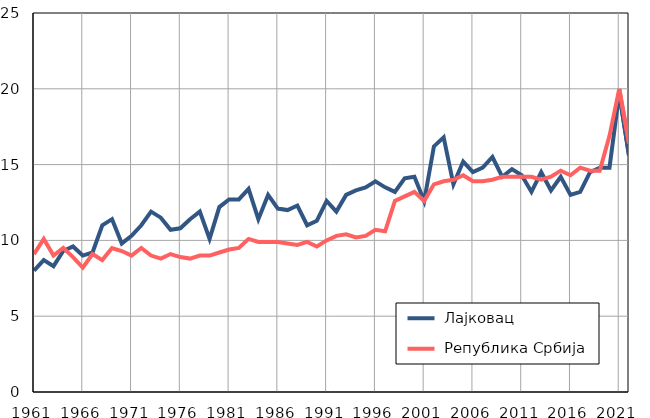
| Category |  Лајковац |  Република Србија |
|---|---|---|
| 1961.0 | 8 | 9.1 |
| 1962.0 | 8.7 | 10.1 |
| 1963.0 | 8.3 | 9 |
| 1964.0 | 9.3 | 9.5 |
| 1965.0 | 9.6 | 8.9 |
| 1966.0 | 9 | 8.2 |
| 1967.0 | 9.2 | 9.1 |
| 1968.0 | 11 | 8.7 |
| 1969.0 | 11.4 | 9.5 |
| 1970.0 | 9.8 | 9.3 |
| 1971.0 | 10.3 | 9 |
| 1972.0 | 11 | 9.5 |
| 1973.0 | 11.9 | 9 |
| 1974.0 | 11.5 | 8.8 |
| 1975.0 | 10.7 | 9.1 |
| 1976.0 | 10.8 | 8.9 |
| 1977.0 | 11.4 | 8.8 |
| 1978.0 | 11.9 | 9 |
| 1979.0 | 10.1 | 9 |
| 1980.0 | 12.2 | 9.2 |
| 1981.0 | 12.7 | 9.4 |
| 1982.0 | 12.7 | 9.5 |
| 1983.0 | 13.4 | 10.1 |
| 1984.0 | 11.4 | 9.9 |
| 1985.0 | 13 | 9.9 |
| 1986.0 | 12.1 | 9.9 |
| 1987.0 | 12 | 9.8 |
| 1988.0 | 12.3 | 9.7 |
| 1989.0 | 11 | 9.9 |
| 1990.0 | 11.3 | 9.6 |
| 1991.0 | 12.6 | 10 |
| 1992.0 | 11.9 | 10.3 |
| 1993.0 | 13 | 10.4 |
| 1994.0 | 13.3 | 10.2 |
| 1995.0 | 13.5 | 10.3 |
| 1996.0 | 13.9 | 10.7 |
| 1997.0 | 13.5 | 10.6 |
| 1998.0 | 13.2 | 12.6 |
| 1999.0 | 14.1 | 12.9 |
| 2000.0 | 14.2 | 13.2 |
| 2001.0 | 12.6 | 12.6 |
| 2002.0 | 16.2 | 13.7 |
| 2003.0 | 16.8 | 13.9 |
| 2004.0 | 13.7 | 14 |
| 2005.0 | 15.2 | 14.3 |
| 2006.0 | 14.5 | 13.9 |
| 2007.0 | 14.8 | 13.9 |
| 2008.0 | 15.5 | 14 |
| 2009.0 | 14.2 | 14.2 |
| 2010.0 | 14.7 | 14.2 |
| 2011.0 | 14.3 | 14.2 |
| 2012.0 | 13.2 | 14.2 |
| 2013.0 | 14.5 | 14 |
| 2014.0 | 13.3 | 14.2 |
| 2015.0 | 14.2 | 14.6 |
| 2016.0 | 13 | 14.3 |
| 2017.0 | 13.2 | 14.8 |
| 2018.0 | 14.5 | 14.6 |
| 2019.0 | 14.8 | 14.6 |
| 2020.0 | 14.8 | 16.9 |
| 2021.0 | 19.7 | 20 |
| 2022.0 | 15.6 | 16.4 |